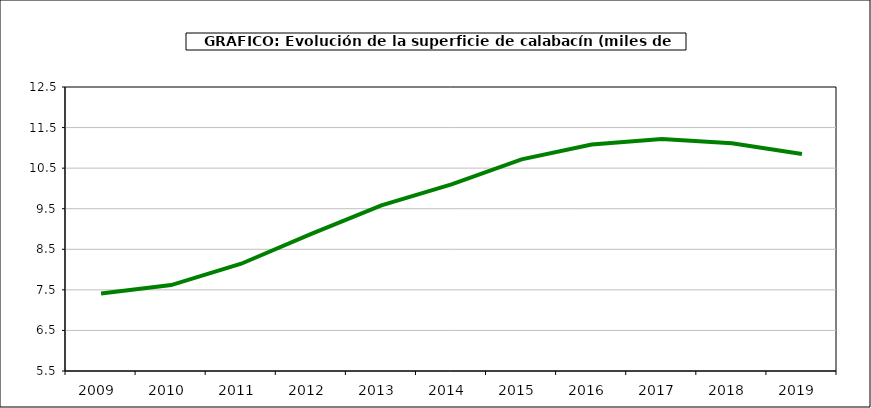
| Category | superficie |
|---|---|
| 2009.0 | 7.41 |
| 2010.0 | 7.618 |
| 2011.0 | 8.144 |
| 2012.0 | 8.879 |
| 2013.0 | 9.582 |
| 2014.0 | 10.102 |
| 2015.0 | 10.717 |
| 2016.0 | 11.081 |
| 2017.0 | 11.218 |
| 2018.0 | 11.112 |
| 2019.0 | 10.851 |